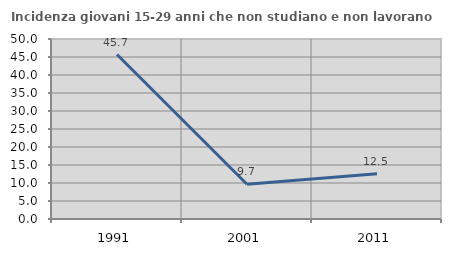
| Category | Incidenza giovani 15-29 anni che non studiano e non lavorano  |
|---|---|
| 1991.0 | 45.678 |
| 2001.0 | 9.668 |
| 2011.0 | 12.544 |